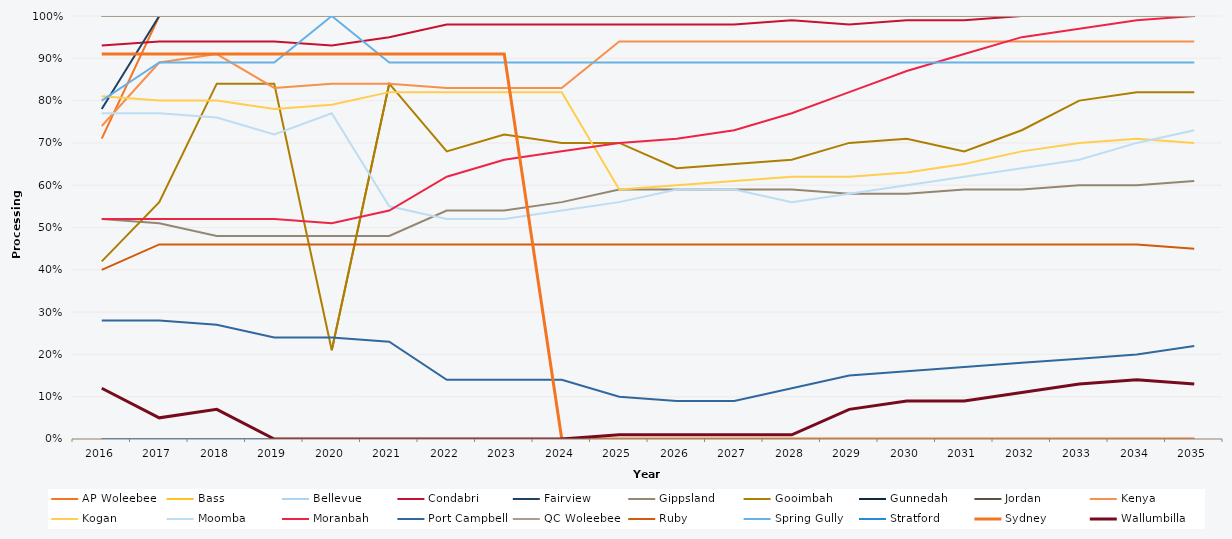
| Category | AP Woleebee | Bass | Bellevue | Condabri | Fairview | Gippsland | Gooimbah | Gunnedah | Jordan | Kenya | Kogan | Moomba | Moranbah | Port Campbell | QC Woleebee | Ruby | Spring Gully | Stratford | Sydney | Wallumbilla |
|---|---|---|---|---|---|---|---|---|---|---|---|---|---|---|---|---|---|---|---|---|
| 2016.0 | 0.71 | 1 | 1 | 0.93 | 0.78 | 0.52 | 0.42 | 0 | 1 | 0.74 | 0.81 | 0.77 | 0.52 | 0.28 | 1 | 0.4 | 0.8 | 0 | 0.91 | 0.12 |
| 2017.0 | 1 | 1 | 1 | 0.94 | 1 | 0.51 | 0.56 | 0 | 1 | 0.89 | 0.8 | 0.77 | 0.52 | 0.28 | 1 | 0.46 | 0.89 | 0 | 0.91 | 0.05 |
| 2018.0 | 1 | 1 | 1 | 0.94 | 1 | 0.48 | 0.84 | 0 | 1 | 0.91 | 0.8 | 0.76 | 0.52 | 0.27 | 1 | 0.46 | 0.89 | 0 | 0.91 | 0.07 |
| 2019.0 | 1 | 1 | 1 | 0.94 | 1 | 0.48 | 0.84 | 0 | 1 | 0.83 | 0.78 | 0.72 | 0.52 | 0.24 | 1 | 0.46 | 0.89 | 0 | 0.91 | 0 |
| 2020.0 | 1 | 1 | 1 | 0.93 | 1 | 0.48 | 0.21 | 0 | 1 | 0.84 | 0.79 | 0.77 | 0.51 | 0.24 | 1 | 0.46 | 1 | 0 | 0.91 | 0 |
| 2021.0 | 1 | 1 | 1 | 0.95 | 1 | 0.48 | 0.84 | 0 | 1 | 0.84 | 0.82 | 0.55 | 0.54 | 0.23 | 1 | 0.46 | 0.89 | 0 | 0.91 | 0 |
| 2022.0 | 1 | 1 | 1 | 0.98 | 1 | 0.54 | 0.68 | 0 | 1 | 0.83 | 0.82 | 0.52 | 0.62 | 0.14 | 1 | 0.46 | 0.89 | 0 | 0.91 | 0 |
| 2023.0 | 1 | 1 | 1 | 0.98 | 1 | 0.54 | 0.72 | 0 | 1 | 0.83 | 0.82 | 0.52 | 0.66 | 0.14 | 1 | 0.46 | 0.89 | 0 | 0.91 | 0 |
| 2024.0 | 1 | 1 | 1 | 0.98 | 1 | 0.56 | 0.7 | 0 | 1 | 0.83 | 0.82 | 0.54 | 0.68 | 0.14 | 1 | 0.46 | 0.89 | 0 | 0 | 0 |
| 2025.0 | 1 | 1 | 1 | 0.98 | 1 | 0.59 | 0.7 | 0 | 1 | 0.94 | 0.59 | 0.56 | 0.7 | 0.1 | 1 | 0.46 | 0.89 | 0 | 0 | 0.01 |
| 2026.0 | 1 | 1 | 1 | 0.98 | 1 | 0.59 | 0.64 | 0 | 1 | 0.94 | 0.6 | 0.59 | 0.71 | 0.09 | 1 | 0.46 | 0.89 | 0 | 0 | 0.01 |
| 2027.0 | 1 | 1 | 1 | 0.98 | 1 | 0.59 | 0.65 | 0 | 1 | 0.94 | 0.61 | 0.59 | 0.73 | 0.09 | 1 | 0.46 | 0.89 | 0 | 0 | 0.01 |
| 2028.0 | 1 | 1 | 1 | 0.99 | 1 | 0.59 | 0.66 | 0 | 1 | 0.94 | 0.62 | 0.56 | 0.77 | 0.12 | 1 | 0.46 | 0.89 | 0 | 0 | 0.01 |
| 2029.0 | 1 | 1 | 1 | 0.98 | 1 | 0.58 | 0.7 | 0 | 1 | 0.94 | 0.62 | 0.58 | 0.82 | 0.15 | 1 | 0.46 | 0.89 | 0 | 0 | 0.07 |
| 2030.0 | 1 | 1 | 1 | 0.99 | 1 | 0.58 | 0.71 | 0 | 1 | 0.94 | 0.63 | 0.6 | 0.87 | 0.16 | 1 | 0.46 | 0.89 | 0 | 0 | 0.09 |
| 2031.0 | 1 | 1 | 1 | 0.99 | 1 | 0.59 | 0.68 | 0 | 1 | 0.94 | 0.65 | 0.62 | 0.91 | 0.17 | 1 | 0.46 | 0.89 | 0 | 0 | 0.09 |
| 2032.0 | 1 | 1 | 1 | 1 | 1 | 0.59 | 0.73 | 0 | 1 | 0.94 | 0.68 | 0.64 | 0.95 | 0.18 | 1 | 0.46 | 0.89 | 0 | 0 | 0.11 |
| 2033.0 | 1 | 1 | 1 | 1 | 1 | 0.6 | 0.8 | 0 | 1 | 0.94 | 0.7 | 0.66 | 0.97 | 0.19 | 1 | 0.46 | 0.89 | 0 | 0 | 0.13 |
| 2034.0 | 1 | 1 | 1 | 1 | 1 | 0.6 | 0.82 | 0 | 1 | 0.94 | 0.71 | 0.7 | 0.99 | 0.2 | 1 | 0.46 | 0.89 | 0 | 0 | 0.14 |
| 2035.0 | 1 | 1 | 1 | 1 | 1 | 0.61 | 0.82 | 0 | 1 | 0.94 | 0.7 | 0.73 | 1 | 0.22 | 1 | 0.45 | 0.89 | 0 | 0 | 0.13 |